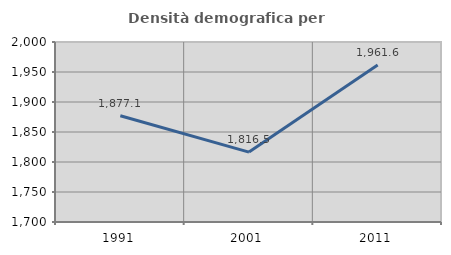
| Category | Densità demografica |
|---|---|
| 1991.0 | 1877.124 |
| 2001.0 | 1816.522 |
| 2011.0 | 1961.592 |